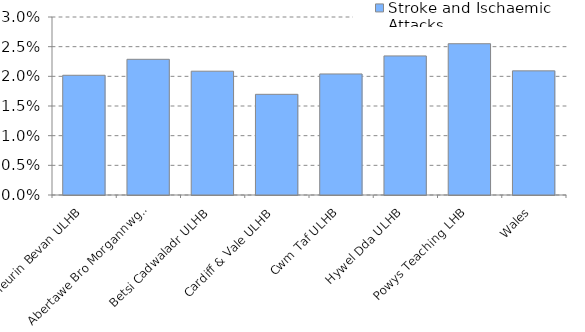
| Category | Stroke and Ischaemic Attacks |
|---|---|
| Aneurin Bevan ULHB | 0.02 |
| Abertawe Bro Morgannwg ULHB | 0.023 |
| Betsi Cadwaladr ULHB | 0.021 |
| Cardiff & Vale ULHB | 0.017 |
| Cwm Taf ULHB | 0.02 |
| Hywel Dda ULHB | 0.023 |
| Powys Teaching LHB | 0.025 |
| Wales | 0.021 |